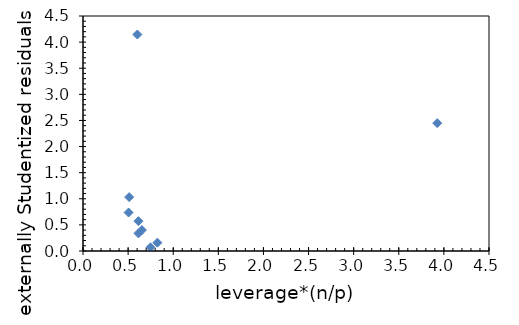
| Category | Series 0 |
|---|---|
| 0.8243699632233652 | 0.16 |
| 0.7483457678655194 | 0.071 |
| 0.6533154985408025 | 0.401 |
| 0.6143530882332255 | 0.571 |
| 0.6143530882332255 | 0.337 |
| 0.5114036236626818 | 1.032 |
| 0.505068276886826 | 0.737 |
| 0.6026326507228181 | 4.145 |
| 3.9261580426315343 | 2.449 |